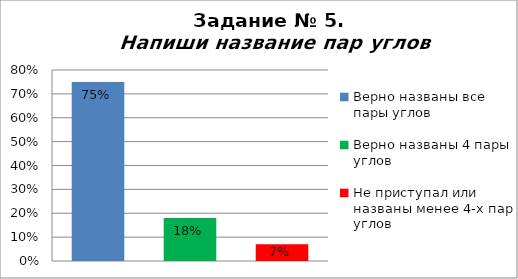
| Category | Напиши название пар углов |
|---|---|
| Верно названы все пары углов | 0.75 |
| Верно названы 4 пары углов | 0.18 |
| Не приступал или названы менее 4-х пар углов | 0.07 |